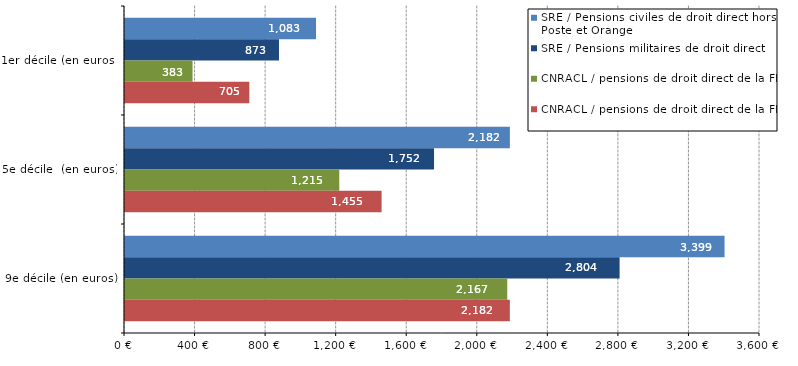
| Category | SRE / Pensions civiles de droit direct hors La Poste et Orange | SRE / Pensions militaires de droit direct | CNRACL / pensions de droit direct de la FPT | CNRACL / pensions de droit direct de la FPH |
|---|---|---|---|---|
| 1er décile (en euros) | 1083 | 873 | 382.9 | 704.9 |
| 5e décile  (en euros) | 2182 | 1752 | 1214.8 | 1454.7 |
| 9e décile (en euros) | 3399 | 2804 | 2167.2 | 2181.8 |